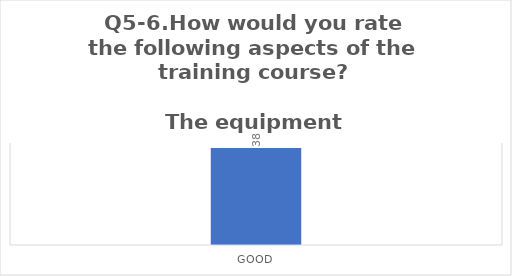
| Category | Q5-6.How would you rate the following aspects of the training course?

The equipment |
|---|---|
| Good | 38 |